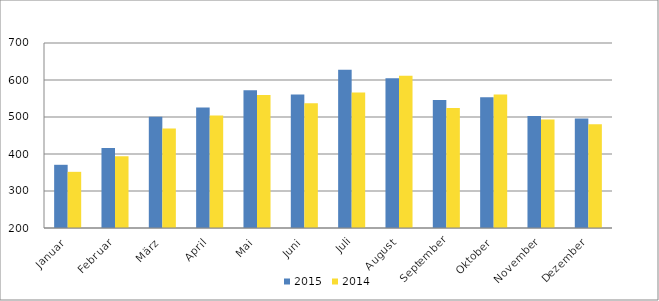
| Category | 2015 | 2014 |
|---|---|---|
| Januar | 370818 | 351815 |
| Februar | 416230 | 394071 |
| März | 500713 | 469220 |
| April | 525728 | 504241 |
| Mai | 572532 | 559134 |
| Juni | 560695 | 537031 |
| Juli | 627891 | 566418 |
| August | 604592 | 611329 |
| September | 545704 | 524482 |
| Oktober | 553225 | 560625 |
| November | 502757 | 493328 |
| Dezember | 495728 | 480072 |